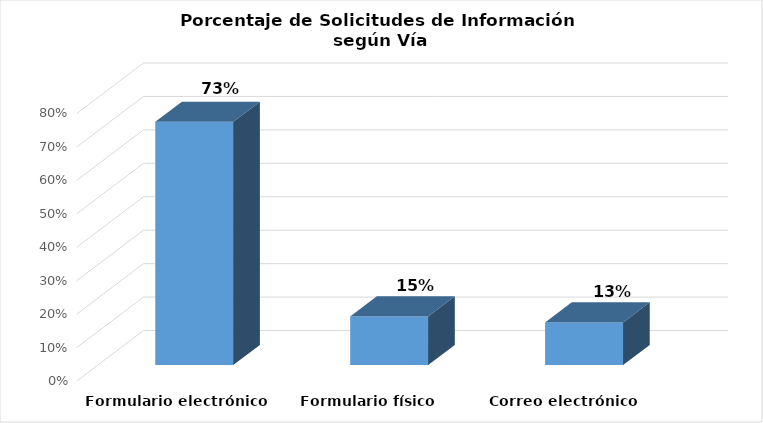
| Category | Series 0 |
|---|---|
| Formulario electrónico SAIP | 0.727 |
| Formulario físico | 0.145 |
| Correo electrónico | 0.127 |